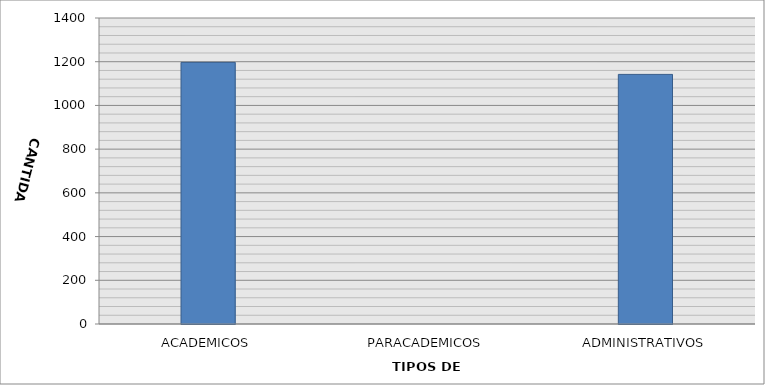
| Category | CANTIDAD |
|---|---|
| ACADEMICOS | 1197 |
| PARACADEMICOS | 0 |
| ADMINISTRATIVOS | 1142 |